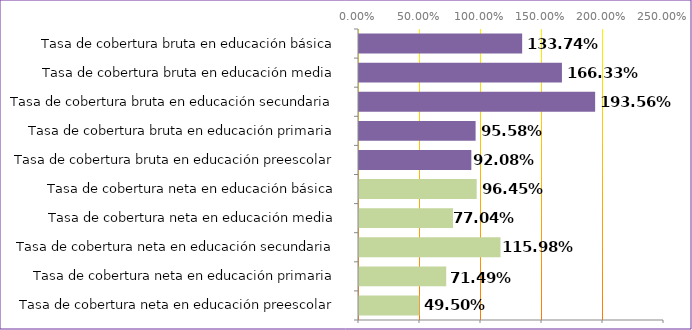
| Category | Series 0 |
|---|---|
| Tasa de cobertura neta en educación preescolar | 0.495 |
| Tasa de cobertura neta en educación primaria | 0.715 |
| Tasa de cobertura neta en educación secundaria | 1.16 |
| Tasa de cobertura neta en educación media | 0.77 |
| Tasa de cobertura neta en educación básica | 0.964 |
| Tasa de cobertura bruta en educación preescolar | 0.921 |
| Tasa de cobertura bruta en educación primaria | 0.956 |
| Tasa de cobertura bruta en educación secundaria | 1.936 |
| Tasa de cobertura bruta en educación media | 1.663 |
| Tasa de cobertura bruta en educación básica | 1.337 |